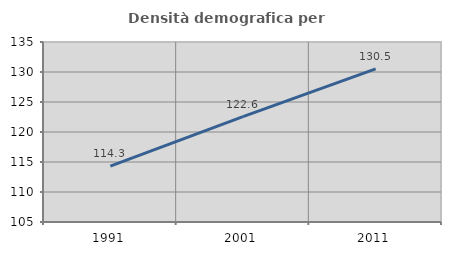
| Category | Densità demografica |
|---|---|
| 1991.0 | 114.316 |
| 2001.0 | 122.558 |
| 2011.0 | 130.507 |